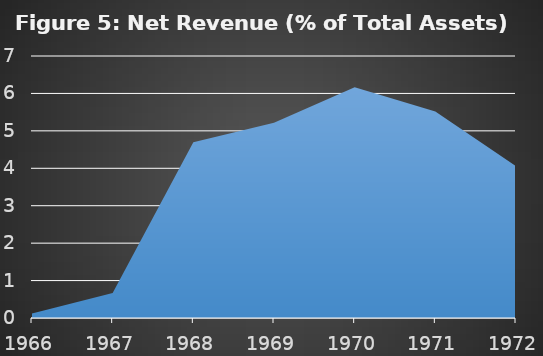
| Category | Series 0 |
|---|---|
| 1966.0 | 0.118 |
| 1967.0 | 0.667 |
| 1968.0 | 4.697 |
| 1969.0 | 5.217 |
| 1970.0 | 6.163 |
| 1971.0 | 5.52 |
| 1972.0 | 4.059 |